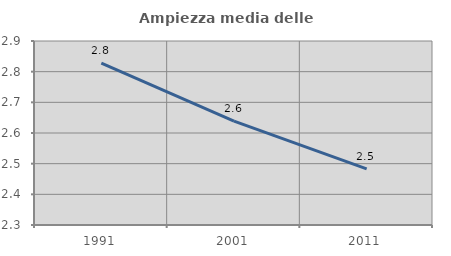
| Category | Ampiezza media delle famiglie |
|---|---|
| 1991.0 | 2.828 |
| 2001.0 | 2.639 |
| 2011.0 | 2.483 |